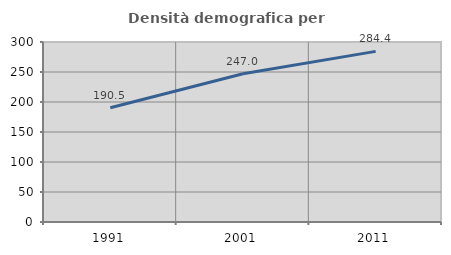
| Category | Densità demografica |
|---|---|
| 1991.0 | 190.531 |
| 2001.0 | 246.954 |
| 2011.0 | 284.365 |